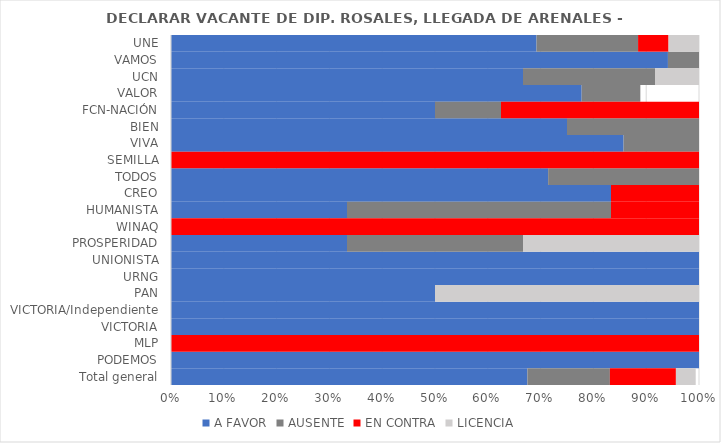
| Category | A FAVOR | AUSENTE | EN CONTRA | LICENCIA |
|---|---|---|---|---|
| UNE | 0.692 | 0.192 | 0.058 | 0.058 |
| VAMOS | 0.941 | 0.059 | 0 | 0 |
| UCN | 0.667 | 0.25 | 0 | 0.083 |
| VALOR | 0.778 | 0.111 | 0 | 0 |
| FCN-NACIÓN | 0.5 | 0.125 | 0.375 | 0 |
| BIEN | 0.75 | 0.25 | 0 | 0 |
| VIVA | 0.857 | 0.143 | 0 | 0 |
| SEMILLA | 0 | 0 | 1 | 0 |
| TODOS | 0.714 | 0.286 | 0 | 0 |
| CREO | 0.833 | 0 | 0.167 | 0 |
| HUMANISTA | 0.333 | 0.5 | 0.167 | 0 |
| WINAQ | 0 | 0 | 1 | 0 |
| PROSPERIDAD | 0.333 | 0.333 | 0 | 0.333 |
| UNIONISTA | 1 | 0 | 0 | 0 |
| URNG | 1 | 0 | 0 | 0 |
| PAN | 0.5 | 0 | 0 | 0.5 |
| VICTORIA/Independiente | 1 | 0 | 0 | 0 |
| VICTORIA | 1 | 0 | 0 | 0 |
| MLP | 0 | 0 | 1 | 0 |
| PODEMOS | 1 | 0 | 0 | 0 |
| Total general | 0.675 | 0.156 | 0.125 | 0.038 |